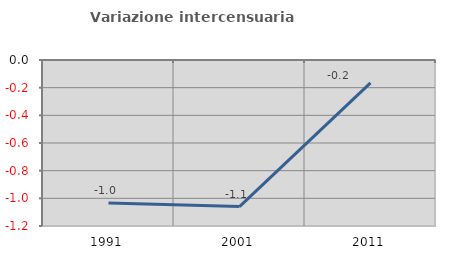
| Category | Variazione intercensuaria annua |
|---|---|
| 1991.0 | -1.033 |
| 2001.0 | -1.06 |
| 2011.0 | -0.165 |